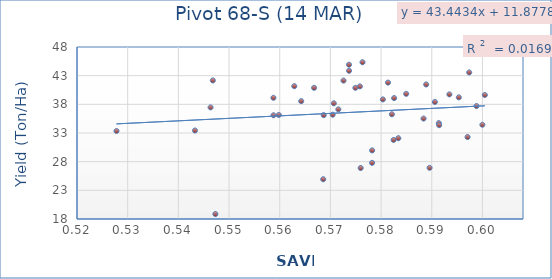
| Category | Series 0 |
|---|---|
| 0.579946 | 39.83 |
| 0.592386 | 43.563 |
| 0.559238 | 38.557 |
| 0.573225 | 27.79 |
| 0.570812 | 41.133 |
| 0.575353 | 38.86 |
| 0.566566 | 37.12 |
| 0.588475 | 39.733 |
| 0.577569 | 39.09 |
| 0.586392 | 34.72 |
| 0.571334 | 45.34 |
| 0.5418 | 42.167 |
| 0.56567 | 38.18 |
| 0.554824 | 36.147 |
| 0.573234 | 29.967 |
| 0.563579 | 24.933 |
| 0.542304 | 18.867 |
| 0.557873 | 41.167 |
| 0.586454 | 34.367 |
| 0.56868 | 43.853 |
| 0.538271 | 33.437 |
| 0.561779 | 40.877 |
| 0.577126 | 36.27 |
| 0.583377 | 35.523 |
| 0.576363 | 41.79 |
| 0.567584 | 42.147 |
| 0.595467 | 39.63 |
| 0.592062 | 32.297 |
| 0.583898 | 41.467 |
| 0.585615 | 38.41 |
| 0.563677 | 36.117 |
| 0.58457 | 26.927 |
| 0.59383 | 37.697 |
| 0.57097 | 26.893 |
| 0.553773 | 36.093 |
| 0.569928 | 40.88 |
| 0.541356 | 37.467 |
| 0.568672 | 44.913 |
| 0.522798 | 33.35 |
| 0.590334 | 39.217 |
| 0.577471 | 31.79 |
| 0.55376 | 39.14 |
| 0.594988 | 34.44 |
| 0.565446 | 36.193 |
| 0.578393 | 32.093 |